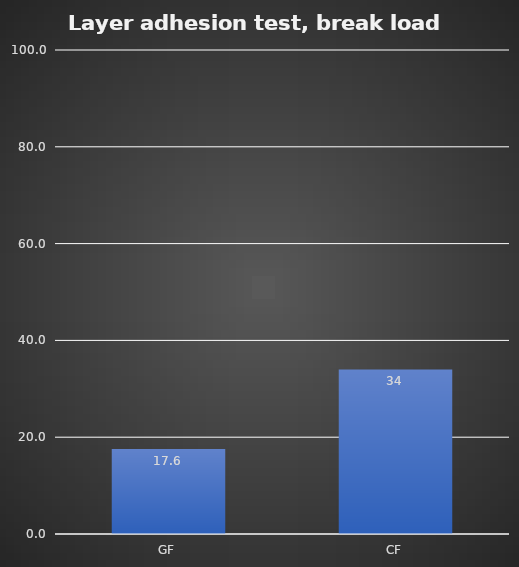
| Category | Average |
|---|---|
| GF | 17.55 |
| CF | 34 |